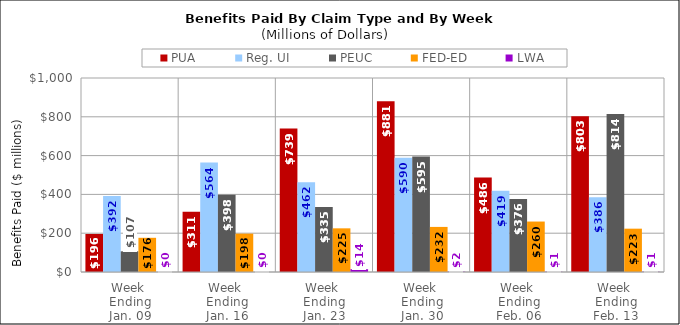
| Category | PUA | Reg. UI | PEUC | FED-ED | LWA |
|---|---|---|---|---|---|
| Week 
Ending
Jan. 09 | 196.076 | 391.836 | 106.58 | 176.301 | 0 |
| Week 
Ending
Jan. 16 | 310.993 | 563.861 | 398.395 | 197.769 | 0 |
| Week 
Ending
Jan. 23 | 739.05 | 462.375 | 334.727 | 225.085 | 14.21 |
| Week 
Ending
Jan. 30 | 880.718 | 589.542 | 595.023 | 232.394 | 1.56 |
| Week 
Ending
Feb. 06 | 486.476 | 419.426 | 376.476 | 260.085 | 1.158 |
| Week 
Ending
Feb. 13 | 803.147 | 385.639 | 814.311 | 223.33 | 1.234 |